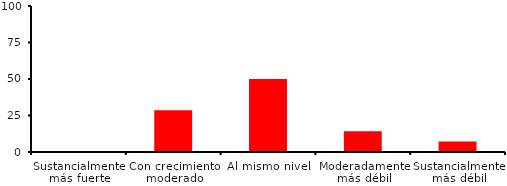
| Category | Series 0 |
|---|---|
| Sustancialmente más fuerte | 0 |
| Con crecimiento moderado | 28.571 |
| Al mismo nivel | 50 |
| Moderadamente más débil | 14.286 |
| Sustancialmente más débil | 7.143 |